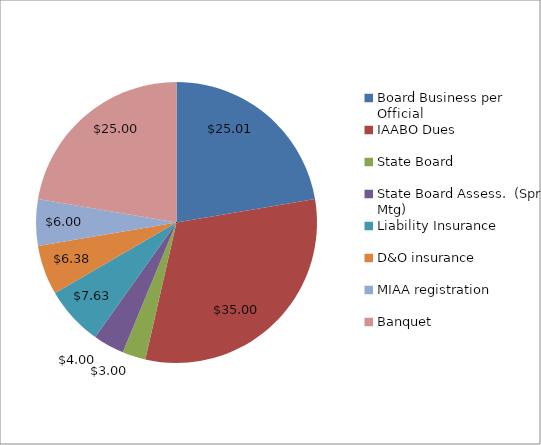
| Category | Series 0 |
|---|---|
| Board Business per Official | 25.009 |
| IAABO Dues | 35 |
| State Board | 3 |
| State Board Assess.  (Spr Mtg) | 4 |
| Liability Insurance | 7.629 |
| D&O insurance | 6.379 |
| MIAA registration | 6 |
| Banquet | 25 |